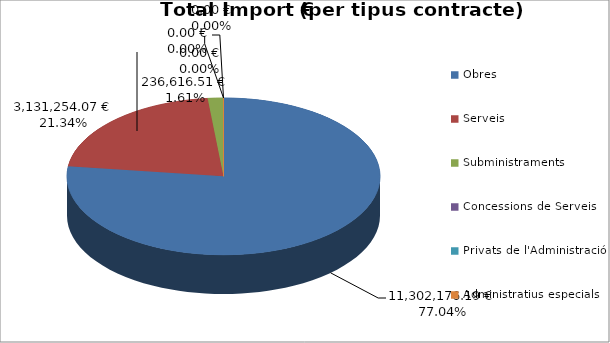
| Category | Total preu              (amb iva) |
|---|---|
| Obres | 11302176.19 |
| Serveis | 3131254.07 |
| Subministraments | 236616.51 |
| Concessions de Serveis | 0 |
| Privats de l'Administració | 0 |
| Administratius especials | 0 |